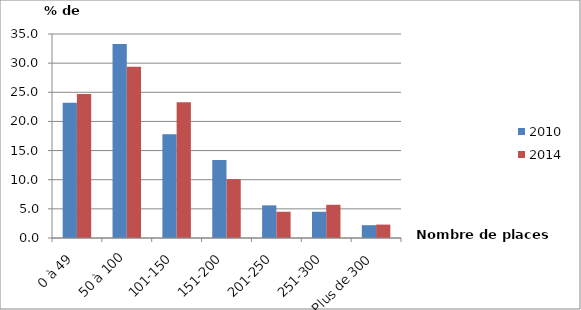
| Category | 2010 | 2014 |
|---|---|---|
| 0 à 49 | 23.2 | 24.7 |
| 50 à 100 | 33.3 | 29.4 |
| 101-150 | 17.8 | 23.3 |
| 151-200 | 13.4 | 10.1 |
| 201-250 | 5.6 | 4.5 |
| 251-300 | 4.5 | 5.7 |
| Plus de 300 | 2.2 | 2.3 |